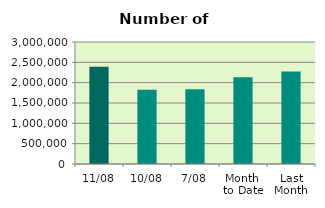
| Category | Series 0 |
|---|---|
| 11/08 | 2392012 |
| 10/08 | 1823720 |
| 7/08 | 1840158 |
| Month 
to Date | 2130786.857 |
| Last
Month | 2275631.565 |